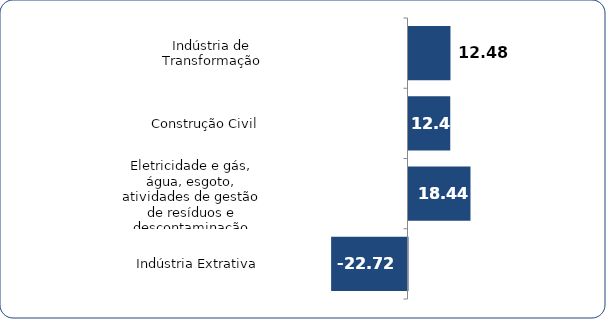
| Category | Series 0 |
|---|---|
| Indústria de Transformação | 12.483 |
| Construção Civil | 12.417 |
| Eletricidade e gás, água, esgoto, atividades de gestão de resíduos e descontaminação | 18.435 |
| Indústria Extrativa | -22.716 |